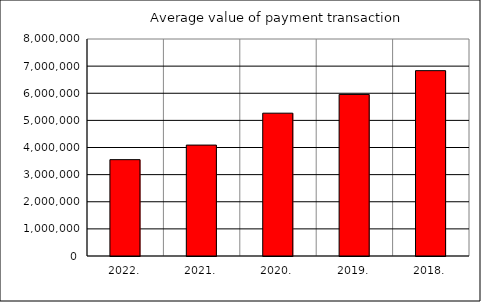
| Category | Average value of payment transaction |
|---|---|
| 2022. | 3552143.424 |
| 2021. | 4089173.228 |
| 2020. | 5265411.19 |
| 2019. | 5956255.714 |
| 2018. | 6833378.133 |